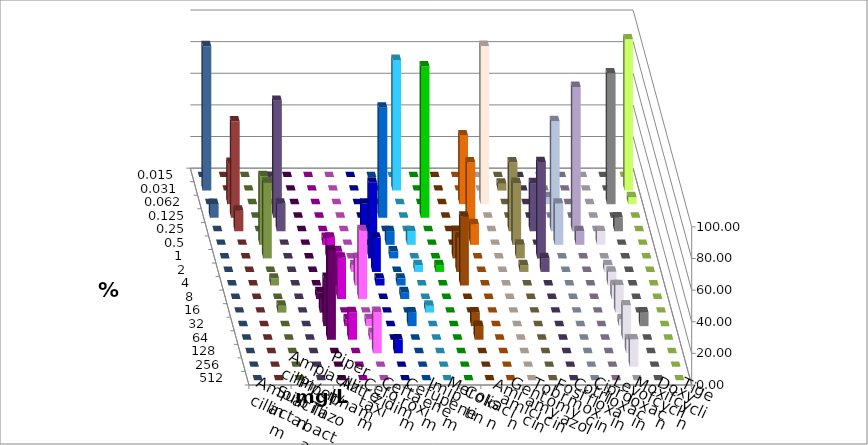
| Category | Ampicillin | Ampicillin/ Sulbactam | Piperacillin | Piperacillin/ Tazobactam | Aztreonam | Cefotaxim | Ceftazidim | Cefuroxim | Imipenem | Meropenem | Colistin | Amikacin | Gentamicin | Tobramycin | Fosfomycin | Cotrimoxazol | Ciprofloxacin | Levofloxacin | Moxifloxacin | Doxycyclin | Tigecyclin |
|---|---|---|---|---|---|---|---|---|---|---|---|---|---|---|---|---|---|---|---|---|---|
| 0.015 | 0 | 0 | 0 | 0 | 0 | 0 | 0 | 0 | 0 | 0 | 0 | 0 | 0 | 0 | 0 | 0 | 0 | 0 | 0 | 0 | 0 |
| 0.031 | 0 | 0 | 0 | 0 | 0 | 82.609 | 0 | 0 | 0 | 0 | 4.348 | 0 | 0 | 0 | 0 | 0 | 95.652 | 91.304 | 0 | 0 | 8.696 |
| 0.062 | 0 | 0 | 0 | 0 | 0 | 0 | 0 | 0 | 43.478 | 100 | 0 | 0 | 4.348 | 0 | 0 | 82.609 | 4.348 | 0 | 26.087 | 0 | 0 |
| 0.125 | 0 | 0 | 0 | 0 | 69.565 | 0 | 95.652 | 0 | 0 | 0 | 0 | 0 | 0 | 0 | 0 | 0 | 0 | 8.696 | 60.87 | 0 | 73.913 |
| 0.25 | 0 | 0 | 0 | 17.391 | 0 | 0 | 0 | 0 | 43.478 | 0 | 43.478 | 30.435 | 69.565 | 91.304 | 0 | 8.696 | 0 | 0 | 13.043 | 0 | 17.391 |
| 0.5 | 0 | 4.348 | 0 | 0 | 8.696 | 8.696 | 0 | 0 | 13.043 | 0 | 39.13 | 0 | 26.087 | 8.696 | 8.696 | 0 | 0 | 0 | 0 | 43.478 | 0 |
| 1.0 | 0 | 13.043 | 0 | 47.826 | 4.348 | 0 | 0 | 17.391 | 0 | 0 | 8.696 | 60.87 | 0 | 0 | 0 | 0 | 0 | 0 | 0 | 47.826 | 0 |
| 2.0 | 0 | 13.043 | 4.348 | 21.739 | 0 | 4.348 | 4.348 | 21.739 | 0 | 0 | 4.348 | 8.696 | 0 | 0 | 4.348 | 0 | 0 | 0 | 0 | 0 | 0 |
| 4.0 | 0 | 21.739 | 17.391 | 4.348 | 4.348 | 0 | 0 | 43.478 | 0 | 0 | 0 | 0 | 0 | 0 | 8.696 | 0 | 0 | 0 | 0 | 4.348 | 0 |
| 8.0 | 4.348 | 26.087 | 43.478 | 0 | 4.348 | 0 | 0 | 0 | 0 | 0 | 0 | 0 | 0 | 0 | 8.696 | 0 | 0 | 0 | 0 | 0 | 0 |
| 16.0 | 8.696 | 0 | 0 | 0 | 0 | 4.348 | 0 | 0 | 0 | 0 | 0 | 0 | 0 | 0 | 17.391 | 0 | 0 | 0 | 0 | 4.348 | 0 |
| 32.0 | 30.435 | 4.348 | 4.348 | 0 | 8.696 | 0 | 0 | 8.696 | 0 | 0 | 0 | 0 | 0 | 0 | 4.348 | 8.696 | 0 | 0 | 0 | 0 | 0 |
| 64.0 | 56.522 | 17.391 | 4.348 | 0 | 0 | 0 | 0 | 8.696 | 0 | 0 | 0 | 0 | 0 | 0 | 21.739 | 0 | 0 | 0 | 0 | 0 | 0 |
| 128.0 | 0 | 0 | 26.087 | 8.696 | 0 | 0 | 0 | 0 | 0 | 0 | 0 | 0 | 0 | 0 | 8.696 | 0 | 0 | 0 | 0 | 0 | 0 |
| 256.0 | 0 | 0 | 0 | 0 | 0 | 0 | 0 | 0 | 0 | 0 | 0 | 0 | 0 | 0 | 17.391 | 0 | 0 | 0 | 0 | 0 | 0 |
| 512.0 | 0 | 0 | 0 | 0 | 0 | 0 | 0 | 0 | 0 | 0 | 0 | 0 | 0 | 0 | 0 | 0 | 0 | 0 | 0 | 0 | 0 |